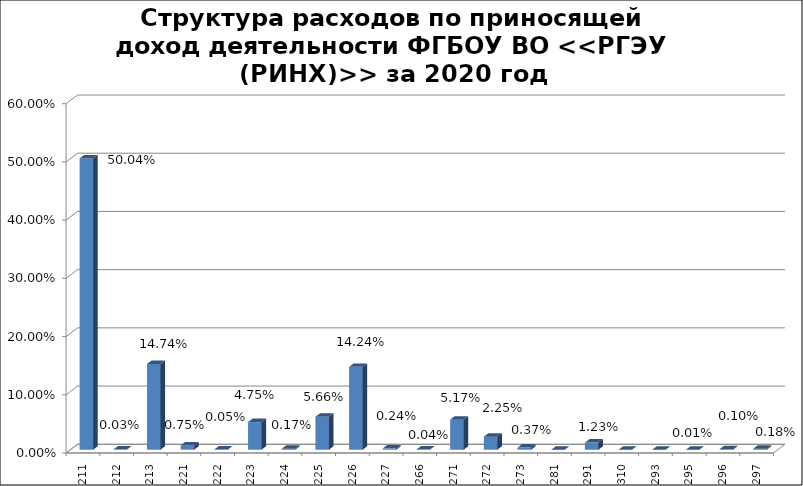
| Category | Series 0 |
|---|---|
|  211 | 0.5 |
|  212 | 0 |
|  213 | 0.147 |
|  221 | 0.007 |
|  222 | 0.001 |
|  223 | 0.047 |
|  224 | 0.002 |
|  225 | 0.057 |
|  226 | 0.142 |
| 227 | 0.002 |
| 266 | 0 |
| 271 | 0.052 |
| 272 | 0.022 |
| 273 | 0.004 |
| 281 | 0 |
| 291 | 0.012 |
| 310 | 0 |
| 293 | 0 |
| 295 | 0 |
| 296 | 0.001 |
| 297 | 0.002 |